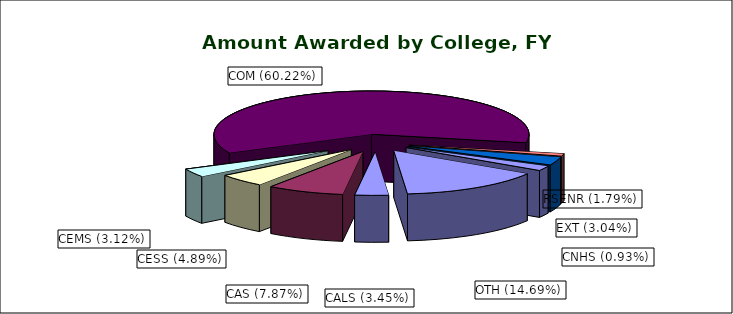
| Category | Series 0 | Series 1 |
|---|---|---|
| CALS (3.45%) | 0.034 | 0.034 |
| CAS (7.87%) | 0.079 | 0.079 |
| CESS (4.89%) | 0.049 | 0.049 |
| CEMS (3.12%) | 0.031 | 0.031 |
| COM (60.22%) | 0.602 | 0.602 |
| CNHS (0.93%) | 0.009 | 0.009 |
| EXT (3.04%) | 0.03 | 0.03 |
| RSENR (1.79%) | 0.018 | 0.018 |
| OTH (14.69%) | 0.147 | 0.147 |